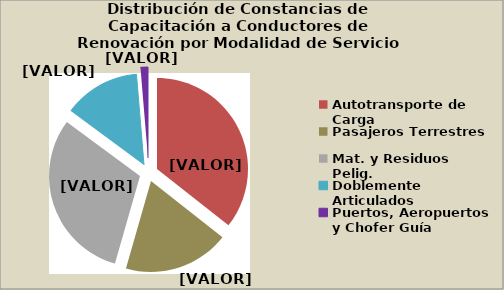
| Category | Series 0 |
|---|---|
| Autotransporte de Carga | 35.625 |
| Pasajeros Terrestres | 18.814 |
| Mat. y Residuos Pelig. | 30.683 |
| Doblemente Articulados | 13.556 |
| Puertos, Aeropuertos y Chofer Guía | 1.323 |